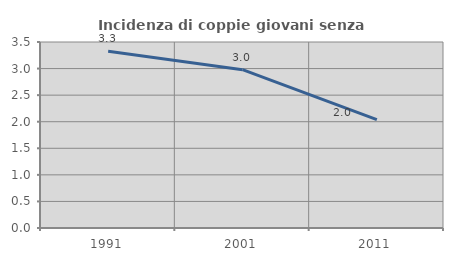
| Category | Incidenza di coppie giovani senza figli |
|---|---|
| 1991.0 | 3.326 |
| 2001.0 | 2.979 |
| 2011.0 | 2.041 |